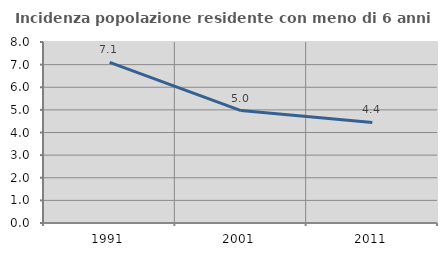
| Category | Incidenza popolazione residente con meno di 6 anni |
|---|---|
| 1991.0 | 7.099 |
| 2001.0 | 4.968 |
| 2011.0 | 4.447 |